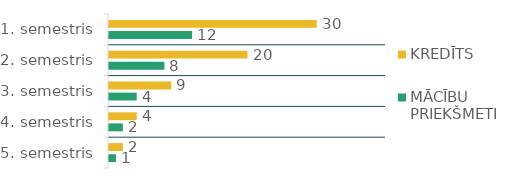
| Category | KREDĪTS  | MĀCĪBU PRIEKŠMETI   |
|---|---|---|
| 1. semestris | 30 | 12 |
| 2. semestris | 20 | 8 |
| 3. semestris | 9 | 4 |
| 4. semestris | 4 | 2 |
| 5. semestris | 2 | 1 |